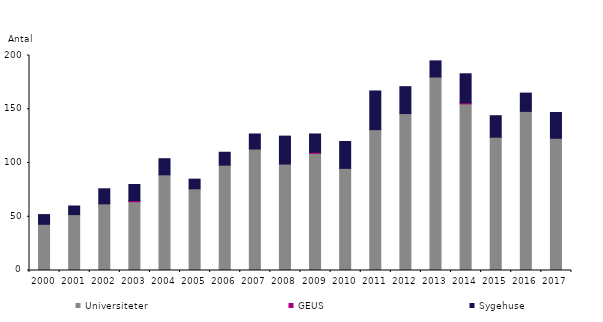
| Category | Universiteter | GEUS  | Sygehuse |
|---|---|---|---|
| 2000.0 | 43 | 0 | 9 |
| 2001.0 | 52 | 0 | 8 |
| 2002.0 | 62 | 0 | 14 |
| 2003.0 | 64 | 1 | 15 |
| 2004.0 | 89 | 0 | 15 |
| 2005.0 | 76 | 0 | 9 |
| 2006.0 | 98 | 0 | 12 |
| 2007.0 | 113 | 0 | 14 |
| 2008.0 | 99 | 0 | 26 |
| 2009.0 | 109 | 1 | 17 |
| 2010.0 | 95 | 0 | 25 |
| 2011.0 | 131 | 0 | 36 |
| 2012.0 | 146 | 0 | 25 |
| 2013.0 | 180 | 0 | 15 |
| 2014.0 | 155 | 1 | 27 |
| 2015.0 | 124 | 0 | 20 |
| 2016.0 | 148 | 0 | 17 |
| 2017.0 | 123 | 0 | 24 |